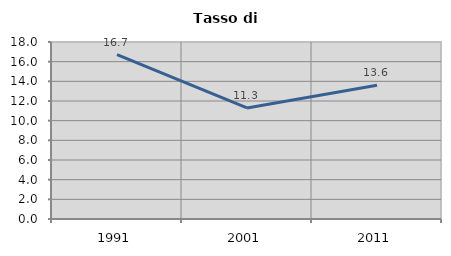
| Category | Tasso di disoccupazione   |
|---|---|
| 1991.0 | 16.726 |
| 2001.0 | 11.29 |
| 2011.0 | 13.609 |